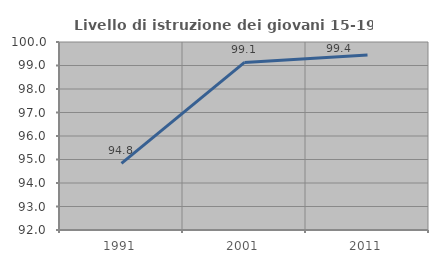
| Category | Livello di istruzione dei giovani 15-19 anni |
|---|---|
| 1991.0 | 94.834 |
| 2001.0 | 99.13 |
| 2011.0 | 99.444 |